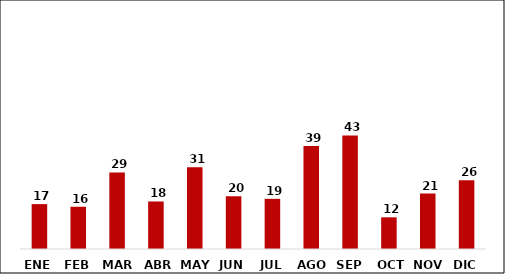
| Category | Series 0 |
|---|---|
| ENE | 17 |
| FEB | 16 |
| MAR | 29 |
| ABR | 18 |
| MAY | 31 |
| JUN | 20 |
| JUL | 19 |
| AGO | 39 |
| SEP | 43 |
| OCT | 12 |
| NOV | 21 |
| DIC | 26 |